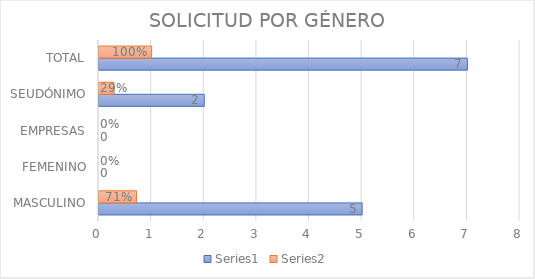
| Category | Series 0 | Series 1 |
|---|---|---|
| MASCULINO | 5 | 0.714 |
| FEMENINO | 0 | 0 |
| EMPRESAS | 0 | 0 |
| SEUDÓNIMO | 2 | 0.286 |
| TOTAL | 7 | 1 |